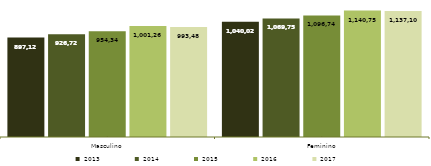
| Category | 2013 | 2014 | 2015 | 2016 | 2017 |
|---|---|---|---|---|---|
| Masculino | 897127 | 926724 | 954347 | 1001260 | 993482 |
| Feminino | 1040024 | 1069757 | 1096740 | 1140754 | 1137100 |